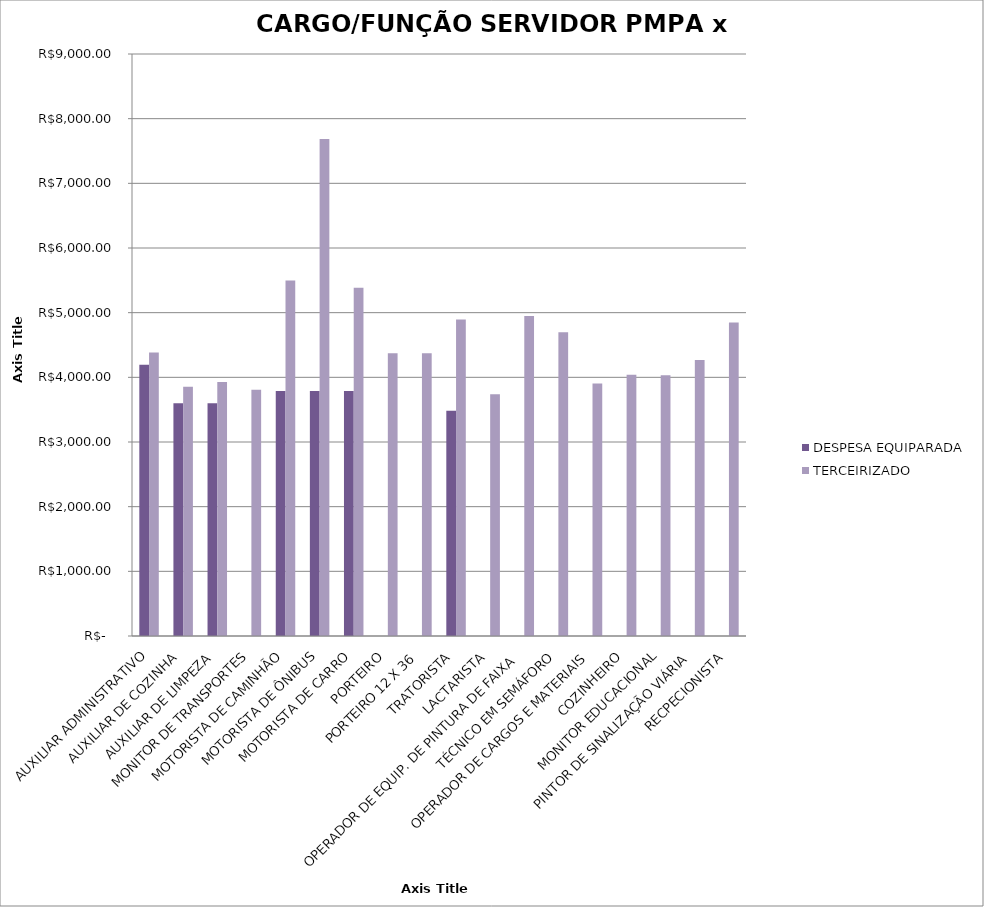
| Category | DESPESA EQUIPARADA | TERCEIRIZADO |
|---|---|---|
| AUXILIAR ADMINISTRATIVO | 4196.283 | 4385.8 |
| AUXILIAR DE COZINHA | 3598.96 | 3853.81 |
| AUXILIAR DE LIMPEZA | 3598.96 | 3929.27 |
| MONITOR DE TRANSPORTES | 0 | 3806.21 |
| MOTORISTA DE CAMINHÃO | 3789.031 | 5499.26 |
| MOTORISTA DE ÔNIBUS | 3789.031 | 7685.4 |
| MOTORISTA DE CARRO | 3789.031 | 5385.44 |
| PORTEIRO | 0 | 4372.97 |
| PORTEIRO 12 X 36 | 0 | 4372.97 |
| TRATORISTA | 3485.02 | 4896.09 |
| LACTARISTA | 0 | 3736.91 |
| OPERADOR DE EQUIP. DE PINTURA DE FAIXA | 0 | 4948.38 |
| TÉCNICO EM SEMÁFORO | 0 | 4698.96 |
| OPERADOR DE CARGOS E MATERIAIS | 0 | 3906.17 |
| COZINHEIRO | 0 | 4040.71 |
| MONITOR EDUCACIONAL | 0 | 4031.62 |
| PINTOR DE SINALIZAÇÃO VIÁRIA | 0 | 4269.02 |
| RECPECIONISTA | 0 | 4847.34 |